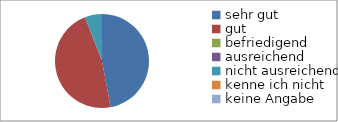
| Category | Series 0 |
|---|---|
| sehr gut | 8 |
| gut | 8 |
| befriedigend | 0 |
| ausreichend | 0 |
| nicht ausreichend | 1 |
| kenne ich nicht | 0 |
| keine Angabe | 0 |